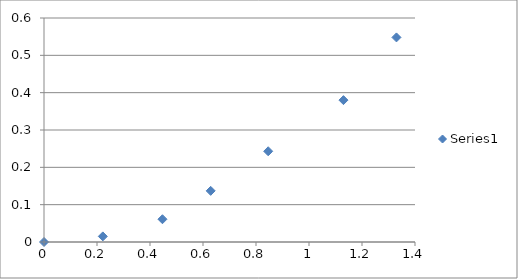
| Category | Series 0 |
|---|---|
| 0.0 | 0 |
| 0.222 | 0.015 |
| 0.447 | 0.061 |
| 0.629 | 0.137 |
| 0.846 | 0.243 |
| 1.13 | 0.38 |
| 1.33 | 0.548 |